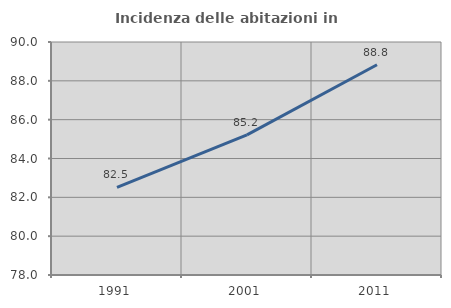
| Category | Incidenza delle abitazioni in proprietà  |
|---|---|
| 1991.0 | 82.511 |
| 2001.0 | 85.219 |
| 2011.0 | 88.828 |